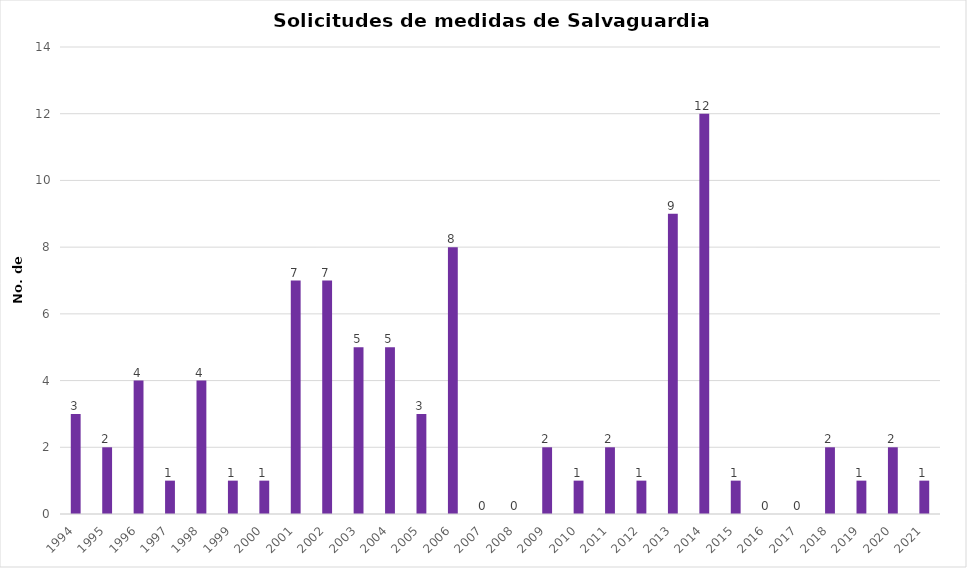
| Category | Series 1 |
|---|---|
| 1994.0 | 3 |
| 1995.0 | 2 |
| 1996.0 | 4 |
| 1997.0 | 1 |
| 1998.0 | 4 |
| 1999.0 | 1 |
| 2000.0 | 1 |
| 2001.0 | 7 |
| 2002.0 | 7 |
| 2003.0 | 5 |
| 2004.0 | 5 |
| 2005.0 | 3 |
| 2006.0 | 8 |
| 2007.0 | 0 |
| 2008.0 | 0 |
| 2009.0 | 2 |
| 2010.0 | 1 |
| 2011.0 | 2 |
| 2012.0 | 1 |
| 2013.0 | 9 |
| 2014.0 | 12 |
| 2015.0 | 1 |
| 2016.0 | 0 |
| 2017.0 | 0 |
| 2018.0 | 2 |
| 2019.0 | 1 |
| 2020.0 | 2 |
| 2021.0 | 1 |